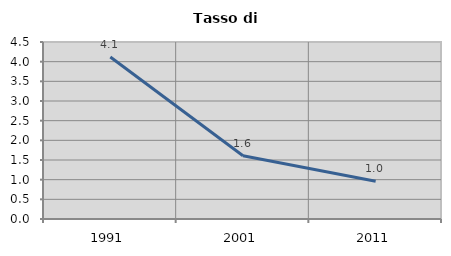
| Category | Tasso di disoccupazione   |
|---|---|
| 1991.0 | 4.119 |
| 2001.0 | 1.61 |
| 2011.0 | 0.962 |